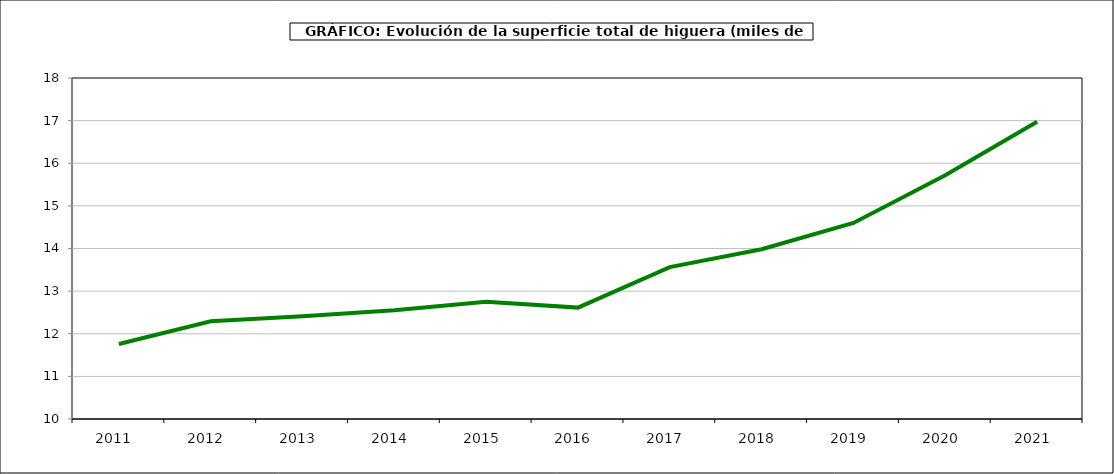
| Category | superficie higuera |
|---|---|
| 2011.0 | 11.761 |
| 2012.0 | 12.294 |
| 2013.0 | 12.411 |
| 2014.0 | 12.549 |
| 2015.0 | 12.751 |
| 2016.0 | 12.613 |
| 2017.0 | 13.564 |
| 2018.0 | 13.983 |
| 2019.0 | 14.599 |
| 2020.0 | 15.72 |
| 2021.0 | 16.973 |